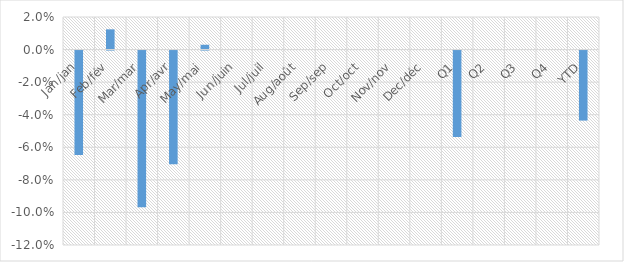
| Category | Total YoY % Change |
|---|---|
| Jan/jan | -0.064 |
| Feb/fév | 0.012 |
| Mar/mar | -0.096 |
| Apr/avr | -0.07 |
| May/mai | 0.003 |
| Jun/juin | 0 |
| Jul/juil | 0 |
| Aug/août | 0 |
| Sep/sep | 0 |
| Oct/oct | 0 |
| Nov/nov | 0 |
| Dec/déc | 0 |
| Q1 | -0.053 |
| Q2 | 0 |
| Q3 | 0 |
| Q4 | 0 |
| YTD | -0.043 |